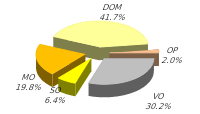
| Category | Series 0 |
|---|---|
| VO | 11833.793 |
| SO | 2505.787 |
| MO | 7759.753 |
| DOM | 16338.859 |
| OP | 786.687 |